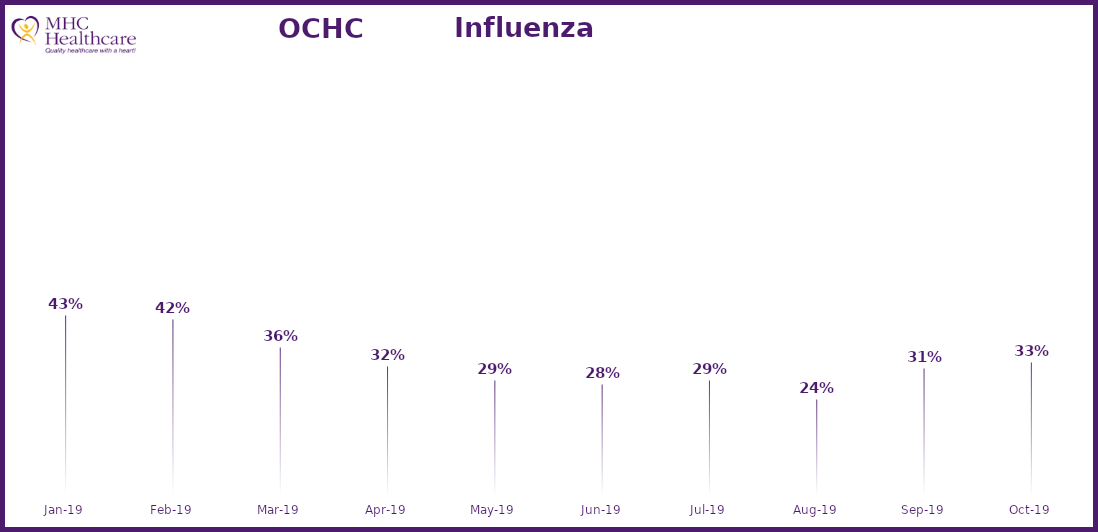
| Category | Online Access to Health Information |
|---|---|
| 2019-01-01 | 0.431 |
| 2019-02-01 | 0.424 |
| 2019-03-01 | 0.361 |
| 2019-04-01 | 0.317 |
| 2019-05-01 | 0.285 |
| 2019-06-01 | 0.276 |
| 2019-07-01 | 0.287 |
| 2019-08-01 | 0.243 |
| 2019-09-01 | 0.312 |
| 2019-10-01 | 0.327 |